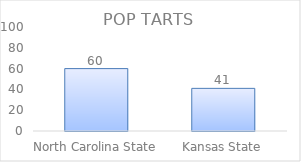
| Category | Series 0 |
|---|---|
| North Carolina State | 60 |
| Kansas State | 41 |